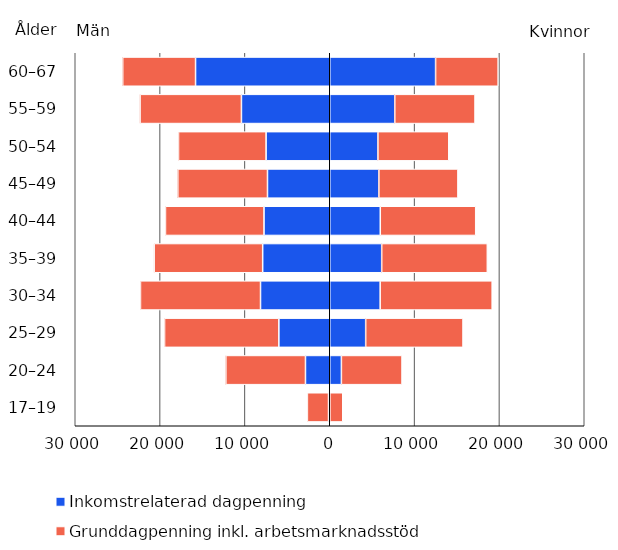
| Category | Series 0 | Series 1 | Inkomstrelaterad dagpenning | Grunddagpenning inkl. arbetsmarknadsstöd |
|---|---|---|---|---|
| 17–19 | -145 | -2491 | 15 | 1518 |
| 20–24 | -2862 | -9385 | 1374 | 7146 |
| 25–29 | -5998 | -13475 | 4236 | 11473 |
| 30–34 | -8160 | -14151 | 5945 | 13201 |
| 35–39 | -7907 | -12790 | 6123 | 12452 |
| 40–44 | -7749 | -11618 | 5956 | 11250 |
| 45–49 | -7338 | -10575 | 5790 | 9319 |
| 50–54 | -7505 | -10324 | 5678 | 8354 |
| 55–59 | -10410 | -11947 | 7663 | 9462 |
| 60–67 | -15819 | -8586 | 12475 | 7377 |